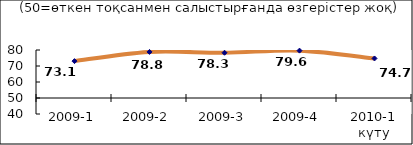
| Category | Диф.индекс ↓ |
|---|---|
| 2009-1 | 73.05 |
| 2009-2 | 78.795 |
| 2009-3 | 78.28 |
| 2009-4 | 79.6 |
| 2010-1 күту | 74.71 |